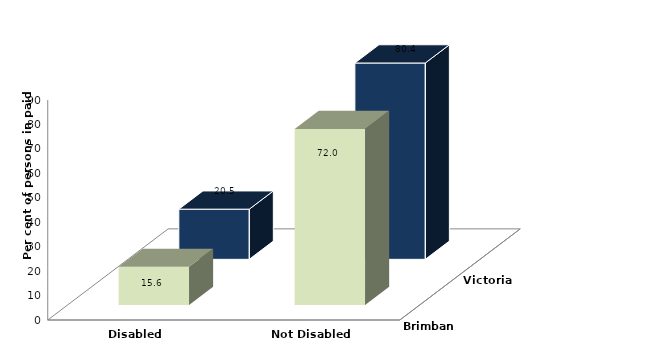
| Category | Brimbank | Victoria |
|---|---|---|
| Disabled | 15.571 | 20.535 |
| Not Disabled | 72.049 | 80.364 |